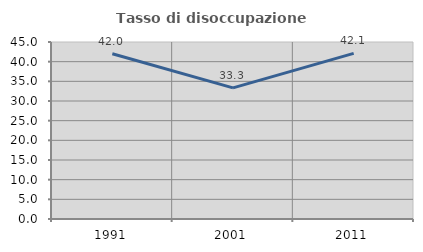
| Category | Tasso di disoccupazione giovanile  |
|---|---|
| 1991.0 | 42 |
| 2001.0 | 33.333 |
| 2011.0 | 42.105 |